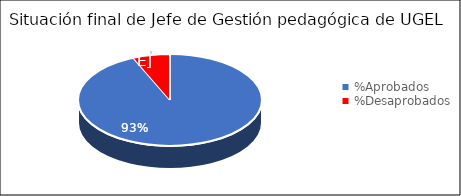
| Category | Series 0 |
|---|---|
| %Aprobados | 0.935 |
| %Desaprobados | 0.065 |